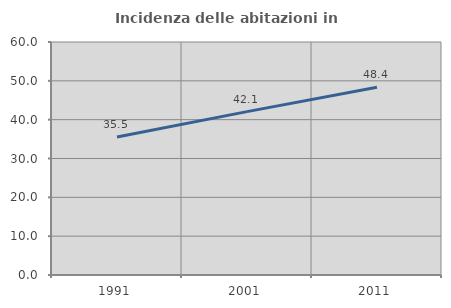
| Category | Incidenza delle abitazioni in proprietà  |
|---|---|
| 1991.0 | 35.546 |
| 2001.0 | 42.07 |
| 2011.0 | 48.359 |